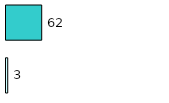
| Category | Series 0 | Series 1 |
|---|---|---|
| 0 | 3 | 62 |